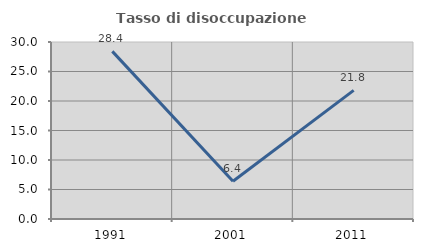
| Category | Tasso di disoccupazione giovanile  |
|---|---|
| 1991.0 | 28.409 |
| 2001.0 | 6.41 |
| 2011.0 | 21.795 |